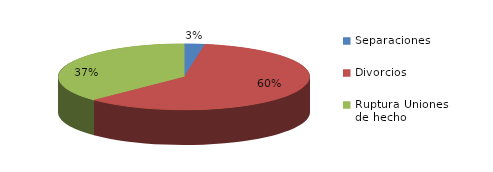
| Category | Series 0 |
|---|---|
| Separaciones | 41 |
| Divorcios | 945 |
| Ruptura Uniones de hecho | 588 |